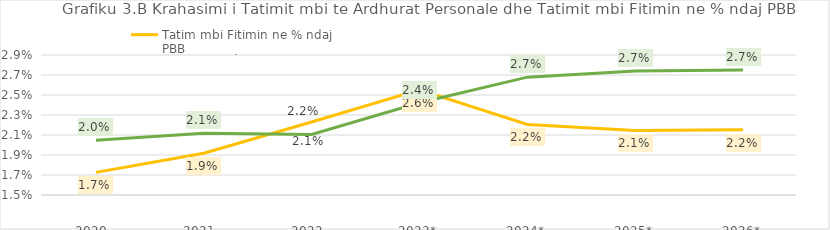
| Category | Tatim mbi Fitimin ne % ndaj PBB | TAP ne % ndaj PBB |
|---|---|---|
| 2020  | 0.017 | 0.02 |
| 2021  | 0.019 | 0.021 |
| 2022  | 0.022 | 0.021 |
| 2023* | 0.026 | 0.024 |
| 2024* | 0.022 | 0.027 |
| 2025* | 0.021 | 0.027 |
| 2026* | 0.022 | 0.027 |